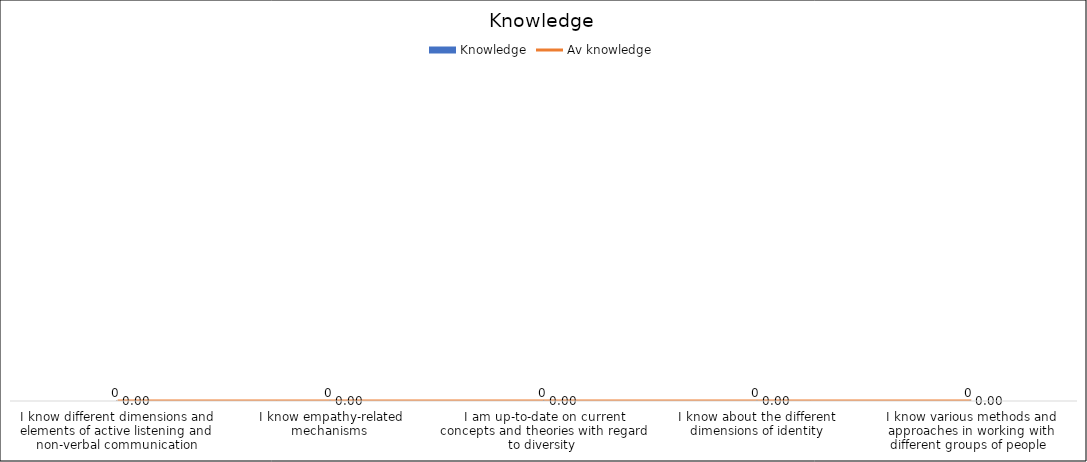
| Category | Knowledge |
|---|---|
| I know different dimensions and elements of active listening and non-verbal communication | 0 |
| I know empathy-related mechanisms  | 0 |
| I am up-to-date on current concepts and theories with regard to diversity  | 0 |
| I know about the different dimensions of identity | 0 |
| I know various methods and approaches in working with different groups of people  | 0 |